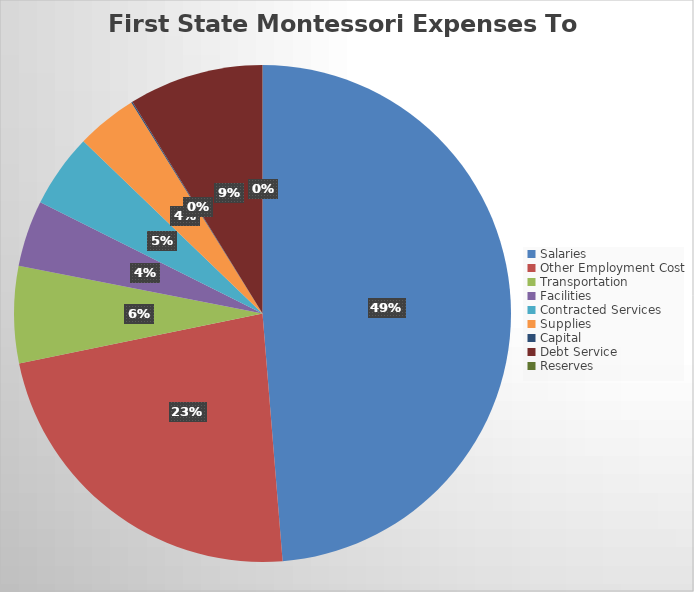
| Category | Series 0 |
|---|---|
| Salaries | 4244007.23 |
| Other Employment Cost | 2009733.13 |
| Transportation | 548866.9 |
| Facilities | 375790.42 |
| Contracted Services | 418553.64 |
| Supplies | 344927.11 |
| Capital | 6645.6 |
| Debt Service | 764340.32 |
| Reserves | 0 |